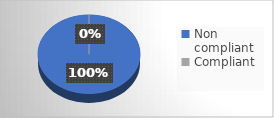
| Category | Series 0 |
|---|---|
| Non compliant | 3 |
| Compliant | 0 |